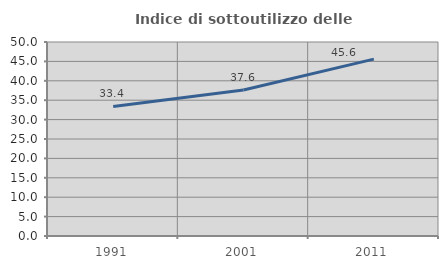
| Category | Indice di sottoutilizzo delle abitazioni  |
|---|---|
| 1991.0 | 33.378 |
| 2001.0 | 37.618 |
| 2011.0 | 45.597 |